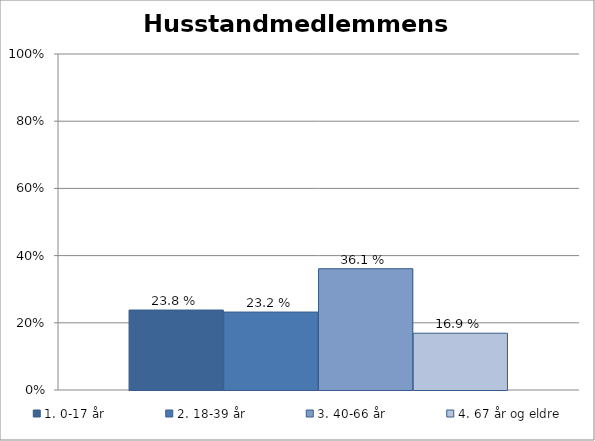
| Category | 1. 0-17 år | 2. 18-39 år | 3. 40-66 år | 4. 67 år og eldre |
|---|---|---|---|---|
| Husstandsmedlemmenes alder? (Kryss av på flere alternativer dersom det er flere alderssammensetninger i husstanden) | 0.238 | 0.232 | 0.361 | 0.169 |